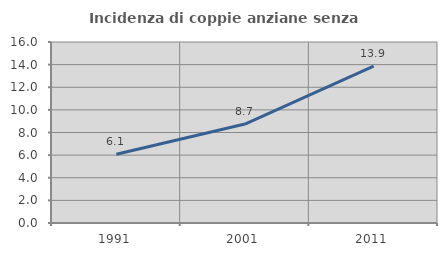
| Category | Incidenza di coppie anziane senza figli  |
|---|---|
| 1991.0 | 6.076 |
| 2001.0 | 8.748 |
| 2011.0 | 13.862 |